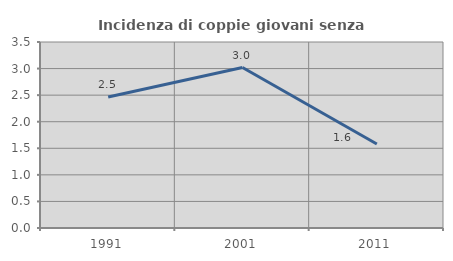
| Category | Incidenza di coppie giovani senza figli |
|---|---|
| 1991.0 | 2.465 |
| 2001.0 | 3.02 |
| 2011.0 | 1.58 |